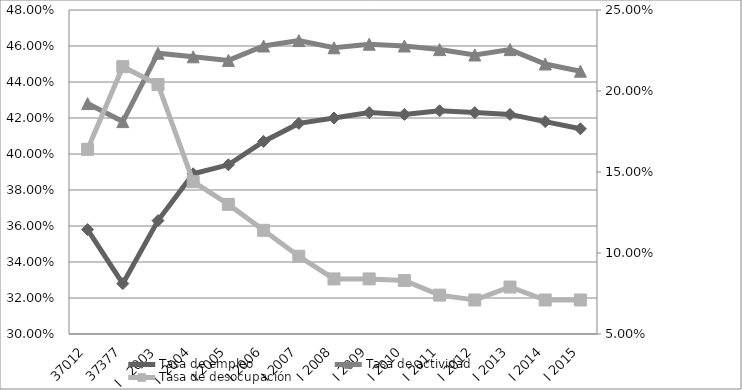
| Category | Tasa de empleo | Tasa de actividad |
|---|---|---|
| may-01 | 0.358 | 0.428 |
| may-02 | 0.328 | 0.418 |
| I   2003 | 0.363 | 0.456 |
| I  2004 | 0.389 | 0.454 |
| I 2005 | 0.394 | 0.452 |
| I 2006 | 0.407 | 0.46 |
| I 2007 | 0.417 | 0.463 |
| I 2008 | 0.42 | 0.459 |
| I 2009 | 0.423 | 0.461 |
| I 2010 | 0.422 | 0.46 |
| I 2011 | 0.424 | 0.458 |
| I 2012 | 0.423 | 0.455 |
| I 2013 | 0.422 | 0.458 |
| I 2014 | 0.418 | 0.45 |
| I 2015 | 0.414 | 0.446 |